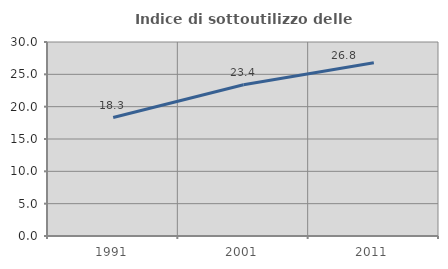
| Category | Indice di sottoutilizzo delle abitazioni  |
|---|---|
| 1991.0 | 18.323 |
| 2001.0 | 23.399 |
| 2011.0 | 26.787 |